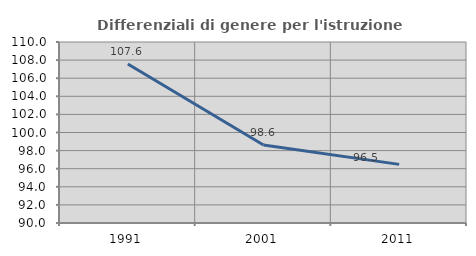
| Category | Differenziali di genere per l'istruzione superiore |
|---|---|
| 1991.0 | 107.56 |
| 2001.0 | 98.614 |
| 2011.0 | 96.479 |